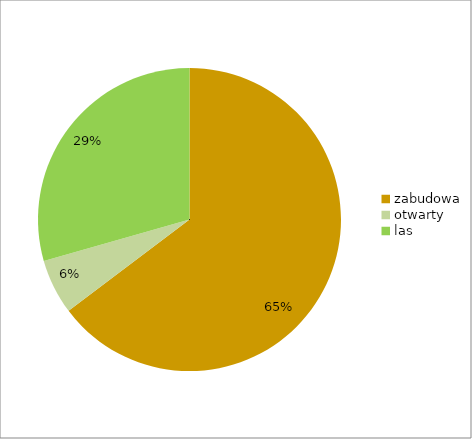
| Category | Series 0 |
|---|---|
| zabudowa | 0.647 |
| otwarty | 0.059 |
| las | 0.294 |